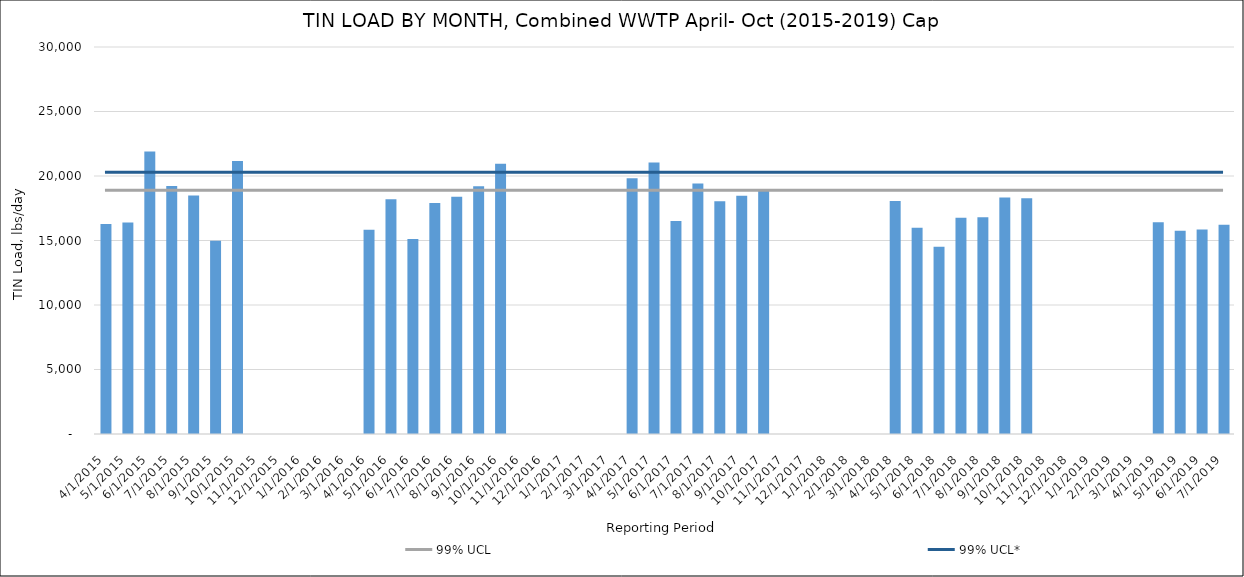
| Category | Series 0 |
|---|---|
| 4/30/15 | 16287.214 |
| 5/31/15 | 16393.016 |
| 6/30/15 | 21900.907 |
| 7/31/15 | 19228.082 |
| 8/31/15 | 18489.96 |
| 9/30/15 | 14984.572 |
| 10/31/15 | 21158.193 |
| 4/30/16 | 15831.48 |
| 5/31/16 | 18200.295 |
| 6/30/16 | 15107.676 |
| 7/31/16 | 17910.344 |
| 8/31/16 | 18385.659 |
| 9/30/16 | 19212.077 |
| 10/31/16 | 20956.694 |
| 4/30/17 | 19825.238 |
| 5/31/17 | 21045.485 |
| 6/30/17 | 16520.206 |
| 7/31/17 | 19417.317 |
| 8/31/17 | 18034.551 |
| 9/30/17 | 18473.705 |
| 10/31/17 | 18838.699 |
| 4/30/18 | 18062.797 |
| 5/31/18 | 15996.389 |
| 6/30/18 | 14519.646 |
| 7/31/18 | 16770.16 |
| 8/31/18 | 16808.381 |
| 9/30/18 | 18339.11 |
| 10/31/18 | 18274.977 |
| 4/30/19 | 16411.139 |
| 5/31/19 | 15759.663 |
| 6/30/19 | 15852.869 |
| 7/31/19 | 16219.045 |